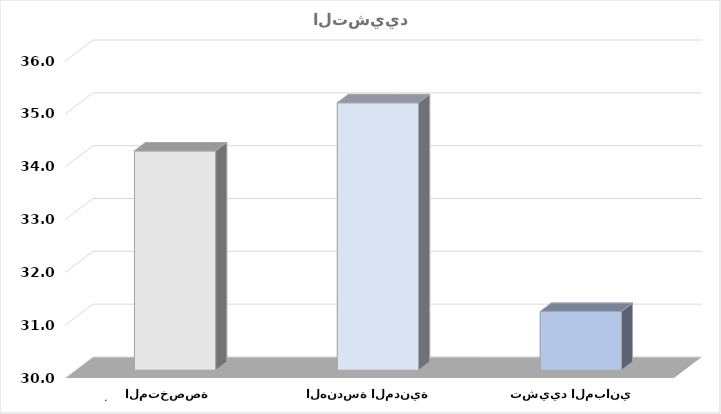
| Category | الجملة |
|---|---|
| تشييد المباني | 31.112 |
| الهندسة المدنية | 35.062 |
| أنشطة التشييد المتخصصة | 34.15 |